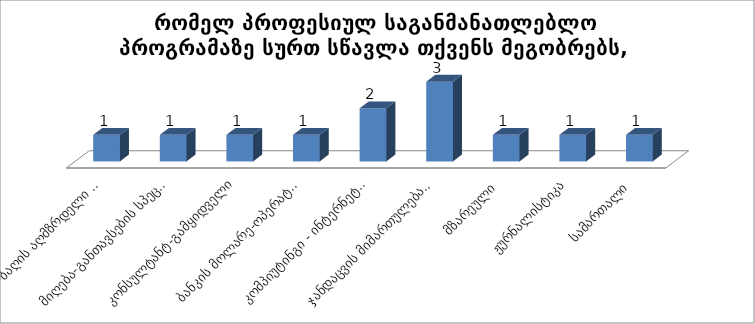
| Category | რომელ პროფესიულ საგანმანათლებლო პროგრამაზე სურთ სწავლა თქვენს მეგობრებს, ნათესავებს? |
|---|---|
| ბაგა-ბაღის აღმზრდელი პედაგოგი | 1 |
| მიღება-განთავსების სპეციალისტი | 1 |
| კონსულტანტ-გამყიდველი | 1 |
| ბანკის მოლარე-ოპერატორი | 1 |
| კომპიუტინგი - ინტერნეტტექნოლოგი | 2 |
| ჯანდაცვის მიმართულება - პრაქტიკოსი ექთანი, მასაჟისტი, კბილის ტექნიკოსი | 3 |
|  მზარეული | 1 |
| ჟურნალისტიკა | 1 |
| სამართალი | 1 |